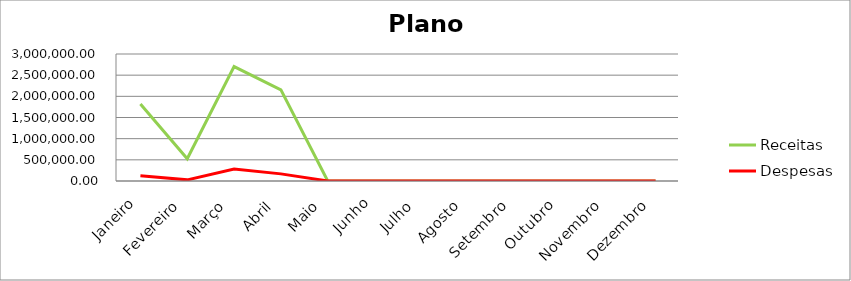
| Category | Receitas | Despesas |
|---|---|---|
| Janeiro | 1819269.95 | 125285.85 |
| Fevereiro | 524715.71 | 26977.14 |
| Março | 2703157.36 | 285077.52 |
| Abril | 2154426.82 | 168211.97 |
| Maio | 0 | 0 |
| Junho | 0 | 0 |
| Julho | 0 | 0 |
| Agosto | 0 | 0 |
| Setembro | 0 | 0 |
| Outubro | 0 | 0 |
| Novembro | 0 | 0 |
| Dezembro | 0 | 0 |